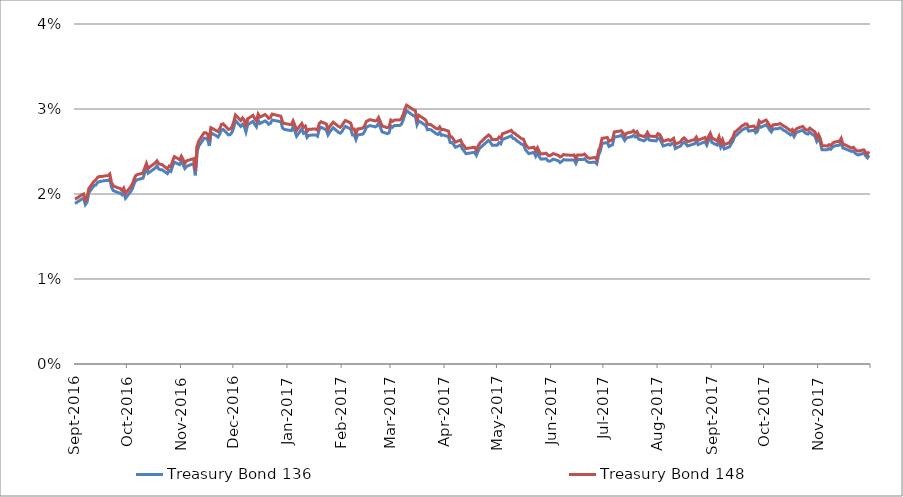
| Category | Treasury Bond 136 | Treasury Bond 148 |
|---|---|---|
| 2016-09-01 | 0.019 | 0.019 |
| 2016-09-02 | 0.019 | 0.02 |
| 2016-09-05 | 0.019 | 0.02 |
| 2016-09-06 | 0.02 | 0.02 |
| 2016-09-07 | 0.019 | 0.019 |
| 2016-09-08 | 0.019 | 0.02 |
| 2016-09-09 | 0.02 | 0.021 |
| 2016-09-12 | 0.021 | 0.022 |
| 2016-09-13 | 0.021 | 0.022 |
| 2016-09-14 | 0.021 | 0.022 |
| 2016-09-15 | 0.021 | 0.022 |
| 2016-09-16 | 0.022 | 0.022 |
| 2016-09-19 | 0.022 | 0.022 |
| 2016-09-20 | 0.022 | 0.022 |
| 2016-09-21 | 0.022 | 0.022 |
| 2016-09-22 | 0.021 | 0.021 |
| 2016-09-23 | 0.02 | 0.021 |
| 2016-09-26 | 0.02 | 0.021 |
| 2016-09-27 | 0.02 | 0.021 |
| 2016-09-28 | 0.02 | 0.02 |
| 2016-09-29 | 0.02 | 0.021 |
| 2016-09-30 | 0.02 | 0.02 |
| 2016-10-03 | 0.02 | 0.021 |
| 2016-10-04 | 0.021 | 0.021 |
| 2016-10-05 | 0.021 | 0.022 |
| 2016-10-06 | 0.022 | 0.022 |
| 2016-10-07 | 0.022 | 0.022 |
| 2016-10-10 | 0.022 | 0.022 |
| 2016-10-11 | 0.022 | 0.023 |
| 2016-10-12 | 0.023 | 0.024 |
| 2016-10-13 | 0.022 | 0.023 |
| 2016-10-14 | 0.023 | 0.023 |
| 2016-10-17 | 0.023 | 0.024 |
| 2016-10-18 | 0.023 | 0.024 |
| 2016-10-19 | 0.023 | 0.024 |
| 2016-10-20 | 0.023 | 0.024 |
| 2016-10-21 | 0.023 | 0.023 |
| 2016-10-24 | 0.022 | 0.023 |
| 2016-10-25 | 0.023 | 0.023 |
| 2016-10-26 | 0.023 | 0.023 |
| 2016-10-27 | 0.023 | 0.024 |
| 2016-10-28 | 0.024 | 0.024 |
| 2016-10-31 | 0.023 | 0.024 |
| 2016-11-01 | 0.024 | 0.024 |
| 2016-11-02 | 0.023 | 0.024 |
| 2016-11-03 | 0.023 | 0.024 |
| 2016-11-04 | 0.023 | 0.024 |
| 2016-11-07 | 0.024 | 0.024 |
| 2016-11-08 | 0.024 | 0.024 |
| 2016-11-09 | 0.022 | 0.023 |
| 2016-11-10 | 0.025 | 0.026 |
| 2016-11-11 | 0.026 | 0.026 |
| 2016-11-14 | 0.027 | 0.027 |
| 2016-11-15 | 0.027 | 0.027 |
| 2016-11-16 | 0.026 | 0.027 |
| 2016-11-17 | 0.026 | 0.026 |
| 2016-11-18 | 0.027 | 0.028 |
| 2016-11-21 | 0.027 | 0.027 |
| 2016-11-22 | 0.027 | 0.027 |
| 2016-11-23 | 0.027 | 0.028 |
| 2016-11-24 | 0.028 | 0.028 |
| 2016-11-25 | 0.028 | 0.028 |
| 2016-11-28 | 0.027 | 0.028 |
| 2016-11-29 | 0.027 | 0.028 |
| 2016-11-30 | 0.027 | 0.028 |
| 2016-12-01 | 0.028 | 0.028 |
| 2016-12-02 | 0.029 | 0.029 |
| 2016-12-05 | 0.028 | 0.029 |
| 2016-12-06 | 0.028 | 0.029 |
| 2016-12-07 | 0.028 | 0.029 |
| 2016-12-08 | 0.027 | 0.028 |
| 2016-12-09 | 0.028 | 0.029 |
| 2016-12-12 | 0.029 | 0.029 |
| 2016-12-13 | 0.028 | 0.029 |
| 2016-12-14 | 0.028 | 0.029 |
| 2016-12-15 | 0.029 | 0.029 |
| 2016-12-16 | 0.028 | 0.029 |
| 2016-12-19 | 0.029 | 0.029 |
| 2016-12-20 | 0.028 | 0.029 |
| 2016-12-21 | 0.028 | 0.029 |
| 2016-12-22 | 0.028 | 0.029 |
| 2016-12-23 | 0.029 | 0.029 |
| 2016-12-28 | 0.028 | 0.029 |
| 2016-12-29 | 0.028 | 0.028 |
| 2016-12-30 | 0.028 | 0.028 |
| 2017-01-03 | 0.027 | 0.028 |
| 2017-01-04 | 0.028 | 0.029 |
| 2017-01-05 | 0.027 | 0.028 |
| 2017-01-06 | 0.027 | 0.028 |
| 2017-01-09 | 0.028 | 0.028 |
| 2017-01-10 | 0.027 | 0.028 |
| 2017-01-11 | 0.027 | 0.028 |
| 2017-01-12 | 0.027 | 0.027 |
| 2017-01-13 | 0.027 | 0.028 |
| 2017-01-16 | 0.027 | 0.028 |
| 2017-01-17 | 0.027 | 0.028 |
| 2017-01-18 | 0.027 | 0.028 |
| 2017-01-19 | 0.028 | 0.028 |
| 2017-01-20 | 0.028 | 0.028 |
| 2017-01-23 | 0.028 | 0.028 |
| 2017-01-24 | 0.027 | 0.028 |
| 2017-01-25 | 0.027 | 0.028 |
| 2017-01-27 | 0.028 | 0.028 |
| 2017-01-30 | 0.027 | 0.028 |
| 2017-01-31 | 0.027 | 0.028 |
| 2017-02-01 | 0.027 | 0.028 |
| 2017-02-02 | 0.028 | 0.028 |
| 2017-02-03 | 0.028 | 0.029 |
| 2017-02-06 | 0.028 | 0.028 |
| 2017-02-07 | 0.027 | 0.028 |
| 2017-02-08 | 0.027 | 0.028 |
| 2017-02-09 | 0.026 | 0.027 |
| 2017-02-10 | 0.027 | 0.028 |
| 2017-02-13 | 0.027 | 0.028 |
| 2017-02-14 | 0.027 | 0.028 |
| 2017-02-15 | 0.028 | 0.029 |
| 2017-02-16 | 0.028 | 0.029 |
| 2017-02-17 | 0.028 | 0.029 |
| 2017-02-20 | 0.028 | 0.029 |
| 2017-02-21 | 0.028 | 0.029 |
| 2017-02-22 | 0.028 | 0.029 |
| 2017-02-23 | 0.028 | 0.028 |
| 2017-02-24 | 0.027 | 0.028 |
| 2017-02-27 | 0.027 | 0.028 |
| 2017-02-28 | 0.027 | 0.028 |
| 2017-03-01 | 0.028 | 0.029 |
| 2017-03-02 | 0.028 | 0.029 |
| 2017-03-03 | 0.028 | 0.029 |
| 2017-03-06 | 0.028 | 0.029 |
| 2017-03-07 | 0.028 | 0.029 |
| 2017-03-08 | 0.029 | 0.029 |
| 2017-03-09 | 0.029 | 0.03 |
| 2017-03-10 | 0.03 | 0.03 |
| 2017-03-13 | 0.029 | 0.03 |
| 2017-03-14 | 0.029 | 0.03 |
| 2017-03-15 | 0.029 | 0.03 |
| 2017-03-16 | 0.028 | 0.029 |
| 2017-03-17 | 0.029 | 0.029 |
| 2017-03-20 | 0.028 | 0.029 |
| 2017-03-21 | 0.028 | 0.029 |
| 2017-03-22 | 0.028 | 0.028 |
| 2017-03-23 | 0.028 | 0.028 |
| 2017-03-24 | 0.028 | 0.028 |
| 2017-03-27 | 0.027 | 0.028 |
| 2017-03-28 | 0.027 | 0.028 |
| 2017-03-29 | 0.027 | 0.028 |
| 2017-03-30 | 0.027 | 0.028 |
| 2017-03-31 | 0.027 | 0.028 |
| 2017-04-03 | 0.027 | 0.027 |
| 2017-04-04 | 0.026 | 0.027 |
| 2017-04-05 | 0.026 | 0.027 |
| 2017-04-06 | 0.026 | 0.026 |
| 2017-04-07 | 0.026 | 0.026 |
| 2017-04-10 | 0.026 | 0.026 |
| 2017-04-11 | 0.025 | 0.026 |
| 2017-04-12 | 0.025 | 0.026 |
| 2017-04-13 | 0.025 | 0.025 |
| 2017-04-18 | 0.025 | 0.026 |
| 2017-04-19 | 0.025 | 0.025 |
| 2017-04-20 | 0.025 | 0.026 |
| 2017-04-21 | 0.025 | 0.026 |
| 2017-04-24 | 0.026 | 0.027 |
| 2017-04-26 | 0.026 | 0.027 |
| 2017-04-27 | 0.026 | 0.027 |
| 2017-04-28 | 0.026 | 0.026 |
| 2017-05-01 | 0.026 | 0.026 |
| 2017-05-02 | 0.026 | 0.027 |
| 2017-05-03 | 0.026 | 0.027 |
| 2017-05-04 | 0.026 | 0.027 |
| 2017-05-05 | 0.026 | 0.027 |
| 2017-05-08 | 0.027 | 0.027 |
| 2017-05-09 | 0.027 | 0.028 |
| 2017-05-10 | 0.027 | 0.027 |
| 2017-05-11 | 0.026 | 0.027 |
| 2017-05-12 | 0.026 | 0.027 |
| 2017-05-15 | 0.026 | 0.026 |
| 2017-05-16 | 0.026 | 0.026 |
| 2017-05-17 | 0.025 | 0.026 |
| 2017-05-18 | 0.025 | 0.026 |
| 2017-05-19 | 0.025 | 0.025 |
| 2017-05-22 | 0.025 | 0.026 |
| 2017-05-23 | 0.024 | 0.025 |
| 2017-05-24 | 0.025 | 0.025 |
| 2017-05-25 | 0.024 | 0.025 |
| 2017-05-26 | 0.024 | 0.025 |
| 2017-05-29 | 0.024 | 0.025 |
| 2017-05-30 | 0.024 | 0.025 |
| 2017-05-31 | 0.024 | 0.024 |
| 2017-06-01 | 0.024 | 0.025 |
| 2017-06-02 | 0.024 | 0.025 |
| 2017-06-05 | 0.024 | 0.025 |
| 2017-06-06 | 0.024 | 0.024 |
| 2017-06-07 | 0.024 | 0.024 |
| 2017-06-08 | 0.024 | 0.025 |
| 2017-06-09 | 0.024 | 0.025 |
| 2017-06-13 | 0.024 | 0.025 |
| 2017-06-14 | 0.024 | 0.025 |
| 2017-06-15 | 0.024 | 0.024 |
| 2017-06-16 | 0.024 | 0.025 |
| 2017-06-19 | 0.024 | 0.025 |
| 2017-06-20 | 0.024 | 0.025 |
| 2017-06-21 | 0.024 | 0.024 |
| 2017-06-22 | 0.024 | 0.024 |
| 2017-06-23 | 0.024 | 0.024 |
| 2017-06-26 | 0.024 | 0.024 |
| 2017-06-27 | 0.024 | 0.024 |
| 2017-06-28 | 0.025 | 0.025 |
| 2017-06-29 | 0.025 | 0.026 |
| 2017-06-30 | 0.026 | 0.027 |
| 2017-07-03 | 0.026 | 0.027 |
| 2017-07-04 | 0.026 | 0.026 |
| 2017-07-05 | 0.026 | 0.026 |
| 2017-07-06 | 0.026 | 0.026 |
| 2017-07-07 | 0.027 | 0.027 |
| 2017-07-10 | 0.027 | 0.027 |
| 2017-07-11 | 0.027 | 0.027 |
| 2017-07-12 | 0.027 | 0.027 |
| 2017-07-13 | 0.026 | 0.027 |
| 2017-07-14 | 0.027 | 0.027 |
| 2017-07-17 | 0.027 | 0.027 |
| 2017-07-18 | 0.027 | 0.027 |
| 2017-07-19 | 0.027 | 0.027 |
| 2017-07-20 | 0.027 | 0.027 |
| 2017-07-21 | 0.026 | 0.027 |
| 2017-07-24 | 0.026 | 0.027 |
| 2017-07-25 | 0.026 | 0.027 |
| 2017-07-26 | 0.027 | 0.027 |
| 2017-07-27 | 0.026 | 0.027 |
| 2017-07-28 | 0.026 | 0.027 |
| 2017-07-31 | 0.026 | 0.027 |
| 2017-08-01 | 0.027 | 0.027 |
| 2017-08-02 | 0.026 | 0.027 |
| 2017-08-03 | 0.026 | 0.027 |
| 2017-08-04 | 0.026 | 0.026 |
| 2017-08-07 | 0.026 | 0.026 |
| 2017-08-08 | 0.026 | 0.026 |
| 2017-08-09 | 0.026 | 0.026 |
| 2017-08-10 | 0.026 | 0.027 |
| 2017-08-11 | 0.025 | 0.026 |
| 2017-08-14 | 0.026 | 0.026 |
| 2017-08-15 | 0.026 | 0.026 |
| 2017-08-16 | 0.026 | 0.027 |
| 2017-08-17 | 0.026 | 0.026 |
| 2017-08-18 | 0.026 | 0.026 |
| 2017-08-21 | 0.026 | 0.026 |
| 2017-08-22 | 0.026 | 0.026 |
| 2017-08-23 | 0.026 | 0.027 |
| 2017-08-24 | 0.026 | 0.026 |
| 2017-08-25 | 0.026 | 0.026 |
| 2017-08-28 | 0.026 | 0.027 |
| 2017-08-29 | 0.026 | 0.026 |
| 2017-08-30 | 0.026 | 0.027 |
| 2017-08-31 | 0.027 | 0.027 |
| 2017-09-01 | 0.026 | 0.027 |
| 2017-09-04 | 0.026 | 0.026 |
| 2017-09-05 | 0.026 | 0.027 |
| 2017-09-06 | 0.026 | 0.026 |
| 2017-09-07 | 0.026 | 0.026 |
| 2017-09-08 | 0.025 | 0.026 |
| 2017-09-11 | 0.026 | 0.026 |
| 2017-09-12 | 0.026 | 0.026 |
| 2017-09-13 | 0.026 | 0.027 |
| 2017-09-14 | 0.027 | 0.027 |
| 2017-09-15 | 0.027 | 0.027 |
| 2017-09-18 | 0.028 | 0.028 |
| 2017-09-19 | 0.028 | 0.028 |
| 2017-09-20 | 0.028 | 0.028 |
| 2017-09-21 | 0.028 | 0.028 |
| 2017-09-22 | 0.027 | 0.028 |
| 2017-09-25 | 0.028 | 0.028 |
| 2017-09-26 | 0.027 | 0.028 |
| 2017-09-27 | 0.027 | 0.028 |
| 2017-09-28 | 0.028 | 0.029 |
| 2017-09-29 | 0.028 | 0.028 |
| 2017-10-02 | 0.028 | 0.029 |
| 2017-10-03 | 0.028 | 0.028 |
| 2017-10-04 | 0.028 | 0.028 |
| 2017-10-05 | 0.027 | 0.028 |
| 2017-10-06 | 0.028 | 0.028 |
| 2017-10-09 | 0.028 | 0.028 |
| 2017-10-10 | 0.028 | 0.028 |
| 2017-10-11 | 0.028 | 0.028 |
| 2017-10-12 | 0.028 | 0.028 |
| 2017-10-13 | 0.027 | 0.028 |
| 2017-10-16 | 0.027 | 0.027 |
| 2017-10-17 | 0.027 | 0.028 |
| 2017-10-18 | 0.027 | 0.027 |
| 2017-10-19 | 0.027 | 0.028 |
| 2017-10-20 | 0.027 | 0.028 |
| 2017-10-23 | 0.028 | 0.028 |
| 2017-10-24 | 0.027 | 0.028 |
| 2017-10-25 | 0.027 | 0.028 |
| 2017-10-26 | 0.027 | 0.028 |
| 2017-10-27 | 0.027 | 0.028 |
| 2017-10-30 | 0.027 | 0.027 |
| 2017-10-31 | 0.026 | 0.027 |
| 2017-11-01 | 0.027 | 0.027 |
| 2017-11-02 | 0.026 | 0.027 |
| 2017-11-03 | 0.025 | 0.026 |
| 2017-11-06 | 0.025 | 0.026 |
| 2017-11-07 | 0.025 | 0.026 |
| 2017-11-08 | 0.025 | 0.026 |
| 2017-11-09 | 0.026 | 0.026 |
| 2017-11-10 | 0.026 | 0.026 |
| 2017-11-13 | 0.026 | 0.026 |
| 2017-11-14 | 0.026 | 0.027 |
| 2017-11-15 | 0.025 | 0.026 |
| 2017-11-16 | 0.025 | 0.026 |
| 2017-11-17 | 0.025 | 0.026 |
| 2017-11-20 | 0.025 | 0.025 |
| 2017-11-21 | 0.025 | 0.026 |
| 2017-11-22 | 0.025 | 0.025 |
| 2017-11-23 | 0.025 | 0.025 |
| 2017-11-24 | 0.025 | 0.025 |
| 2017-11-27 | 0.025 | 0.025 |
| 2017-11-28 | 0.024 | 0.025 |
| 2017-11-29 | 0.024 | 0.025 |
| 2017-11-30 | 0.025 | 0.025 |